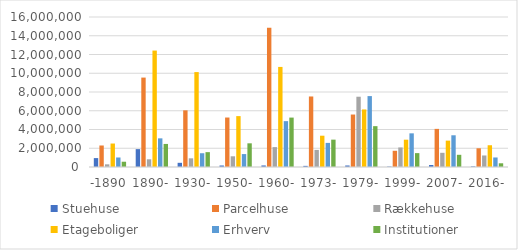
| Category | Stuehuse | Parcelhuse | Rækkehuse | Etageboliger | Erhverv | Institutioner |
|---|---|---|---|---|---|---|
| -1890 | 949582 | 2294032 | 285657 | 2504245 | 1014325 | 562730 |
| 1890- | 1906019 | 9537735 | 822276 | 12419591 | 3056190 | 2459909 |
| 1930- | 446527 | 6044443 | 925338 | 10124135 | 1469038 | 1584822 |
| 1950- | 161974 | 5277495 | 1143131 | 5428698 | 1379013 | 2526062 |
| 1960- | 166397 | 14845809 | 2119442 | 10674917 | 4891785 | 5270635 |
| 1973- | 121246 | 7521914 | 1822024 | 3338218 | 2570974 | 2917666 |
| 1979- | 161977 | 5596560 | 7495629 | 6136947 | 7563751 | 4356640 |
| 1999- | 46433 | 1729920 | 2083605 | 2913240 | 3590562 | 1479974 |
| 2007- | 211075 | 4066719 | 1514203 | 2813826 | 3383726 | 1300594 |
| 2016- | 63829 | 1997302 | 1228968 | 2321804 | 1015720 | 396163 |